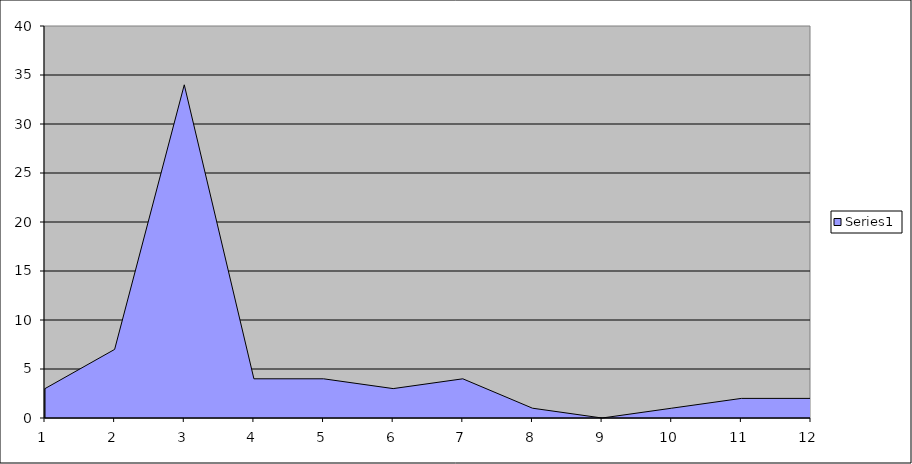
| Category | Series 0 |
|---|---|
| 0 | 3 |
| 1 | 7 |
| 2 | 34 |
| 3 | 4 |
| 4 | 4 |
| 5 | 3 |
| 6 | 4 |
| 7 | 1 |
| 8 | 0 |
| 9 | 1 |
| 10 | 2 |
| 11 | 2 |